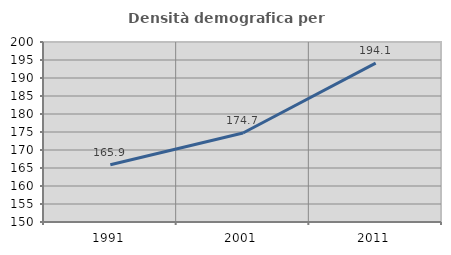
| Category | Densità demografica |
|---|---|
| 1991.0 | 165.912 |
| 2001.0 | 174.73 |
| 2011.0 | 194.128 |